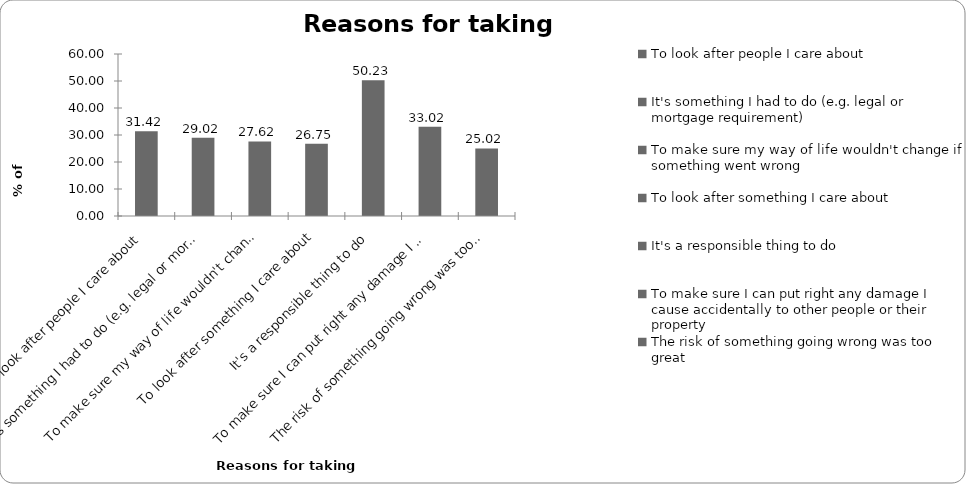
| Category | Reasons for taking insurance |
|---|---|
| To look after people I care about | 31.421 |
| It's something I had to do (e.g. legal or mortgage requirement) | 29.019 |
| To make sure my way of life wouldn't change if something went wrong | 27.618 |
| To look after something I care about | 26.751 |
| It's a responsible thing to do | 50.233 |
| To make sure I can put right any damage I cause accidentally to other people or their property | 33.022 |
| The risk of something going wrong was too great | 25.017 |